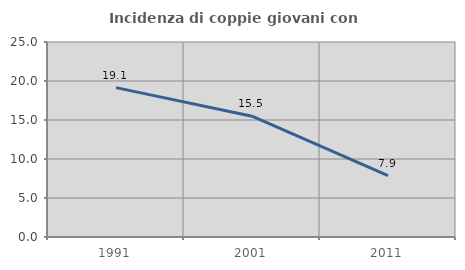
| Category | Incidenza di coppie giovani con figli |
|---|---|
| 1991.0 | 19.149 |
| 2001.0 | 15.481 |
| 2011.0 | 7.86 |